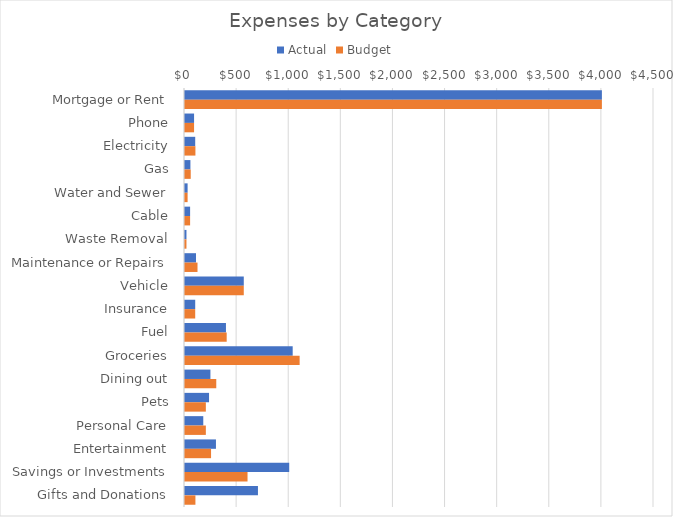
| Category | Actual | Budget |
|---|---|---|
| Mortgage or Rent | 4000 | 4000 |
| Phone | 87 | 87 |
| Electricity | 98 | 100 |
| Gas | 52 | 55 |
| Water and Sewer | 25 | 25 |
| Cable | 49 | 49 |
| Waste Removal | 14 | 14 |
| Maintenance or Repairs | 105.57 | 120 |
| Vehicle | 563.97 | 563.97 |
| Insurance | 98 | 98 |
| Fuel | 393.02 | 400 |
| Groceries | 1033.32 | 1100 |
| Dining out | 243.93 | 300 |
| Pets | 230.71 | 200 |
| Personal Care | 175.36 | 200 |
| Entertainment | 296.99 | 250 |
| Savings or Investments | 1000 | 600 |
| Gifts and Donations | 700 | 100 |